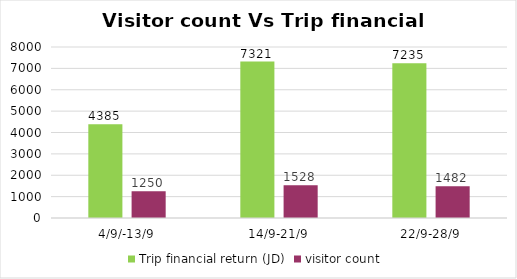
| Category | Trip financial return (JD) | visitor count  |
|---|---|---|
| 4/9/-13/9 | 4385 | 1250 |
| 14/9-21/9 | 7321 | 1528 |
| 22/9-28/9 | 7235 | 1482 |